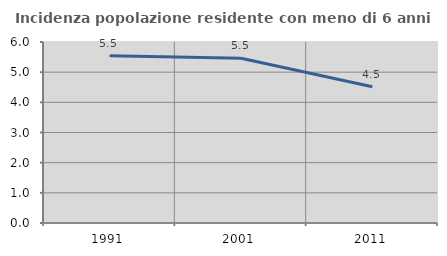
| Category | Incidenza popolazione residente con meno di 6 anni |
|---|---|
| 1991.0 | 5.544 |
| 2001.0 | 5.463 |
| 2011.0 | 4.515 |